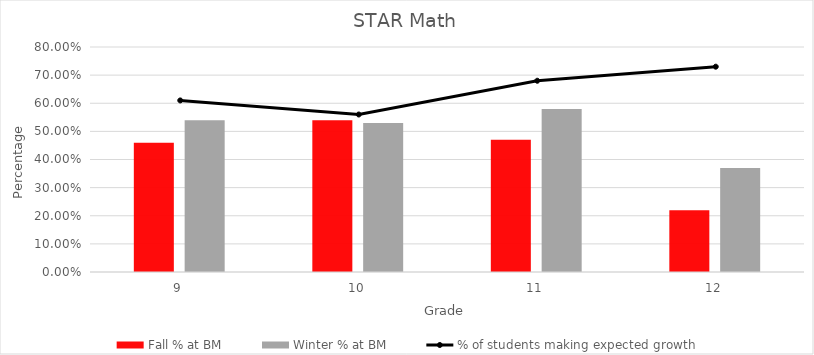
| Category | Fall % at BM | Winter % at BM |
|---|---|---|
| 9.0 | 0.46 | 0.54 |
| 10.0 | 0.54 | 0.53 |
| 11.0 | 0.47 | 0.58 |
| 12.0 | 0.22 | 0.37 |